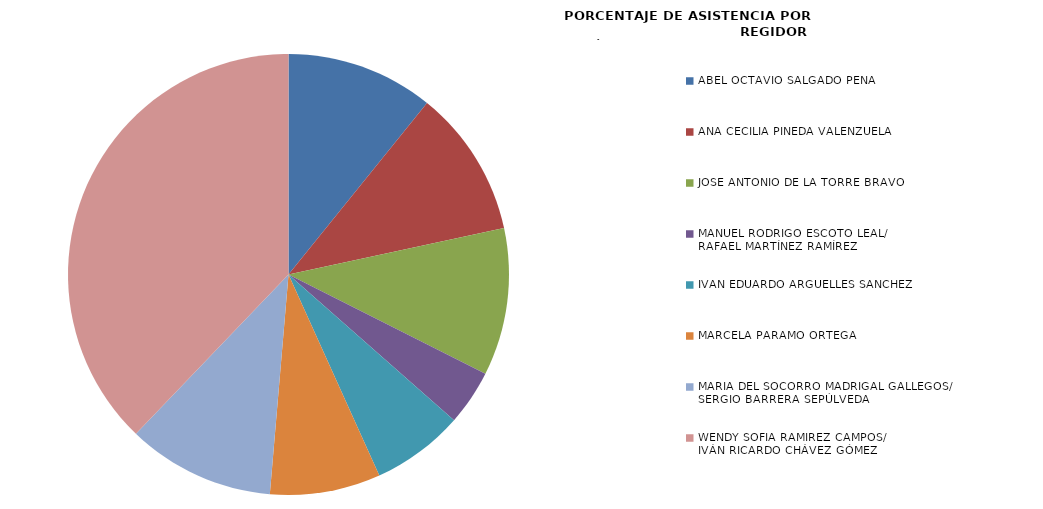
| Category | Series 0 |
|---|---|
| ABEL OCTAVIO SALGADO PEÑA | 100 |
| ANA CECILIA PINEDA VALENZUELA | 100 |
| JOSÉ ANTONIO DE LA TORRE BRAVO | 100 |
| MANUEL RODRIGO ESCOTO LEAL/
RAFAEL MARTÍNEZ RAMÍREZ | 37.5 |
| IVÁN EDUARDO ARGÜELLES SÁNCHEZ | 62.5 |
| MARCELA PÁRAMO ORTEGA | 75 |
| MARÍA DEL SOCORRO MADRIGAL GALLEGOS/
SERGIO BARRERA SEPÚLVEDA | 100 |
| WENDY SOFÍA RAMÍREZ CAMPOS/
IVÁN RICARDO CHÁVEZ GÓMEZ | 350 |